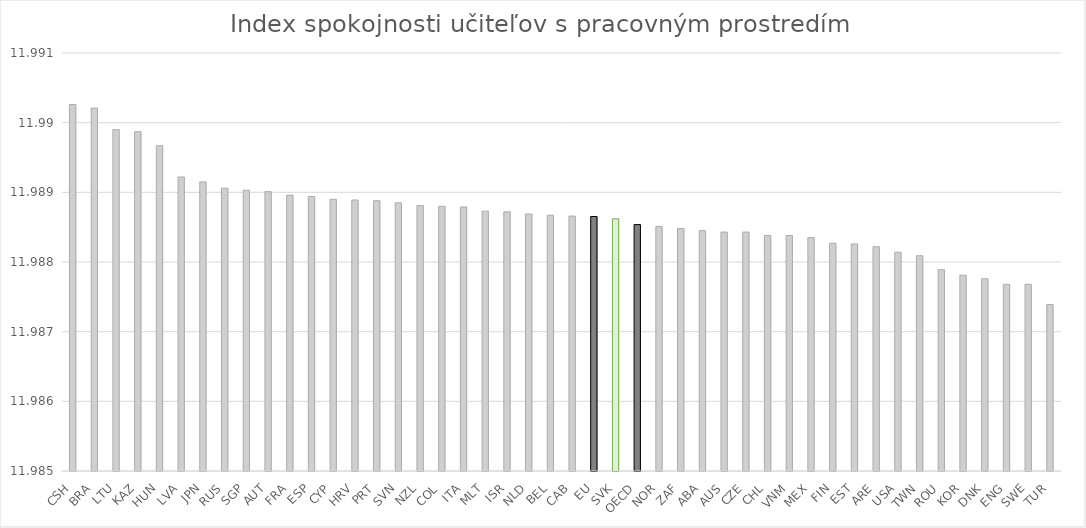
| Category | Series 0 |
|---|---|
| CSH | 11.99 |
| BRA | 11.99 |
| LTU | 11.99 |
| KAZ | 11.99 |
| HUN | 11.99 |
| LVA | 11.989 |
| JPN | 11.989 |
| RUS | 11.989 |
| SGP | 11.989 |
| AUT | 11.989 |
| FRA | 11.989 |
| ESP | 11.989 |
| CYP | 11.989 |
| HRV | 11.989 |
| PRT | 11.989 |
| SVN | 11.989 |
| NZL | 11.989 |
| COL | 11.989 |
| ITA | 11.989 |
| MLT | 11.989 |
| ISR | 11.989 |
| NLD | 11.989 |
| BEL | 11.989 |
| CAB | 11.989 |
| EU | 11.989 |
| SVK | 11.989 |
| OECD | 11.989 |
| NOR | 11.989 |
| ZAF | 11.988 |
| ABA | 11.988 |
| AUS | 11.988 |
| CZE | 11.988 |
| CHL | 11.988 |
| VNM | 11.988 |
| MEX | 11.988 |
| FIN | 11.988 |
| EST | 11.988 |
| ARE | 11.988 |
| USA | 11.988 |
| TWN | 11.988 |
| ROU | 11.988 |
| KOR | 11.988 |
| DNK | 11.988 |
| ENG | 11.988 |
| SWE | 11.988 |
| TUR | 11.987 |